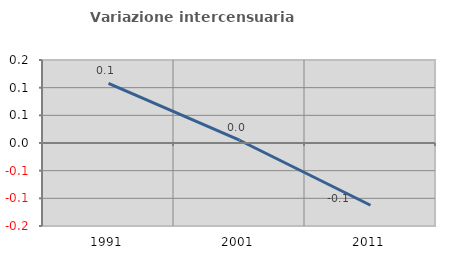
| Category | Variazione intercensuaria annua |
|---|---|
| 1991.0 | 0.108 |
| 2001.0 | 0.005 |
| 2011.0 | -0.112 |